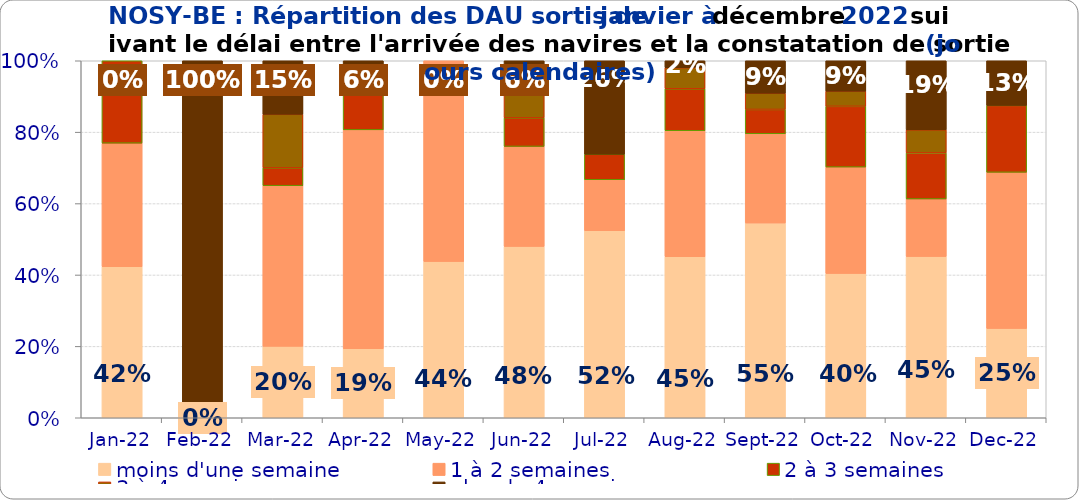
| Category | moins d'une semaine | 1 à 2 semaines | 2 à 3 semaines | 3 à 4 semaines | plus de 4 semaines |
|---|---|---|---|---|---|
| 2022-01-01 | 0.423 | 0.346 | 0.231 | 0 | 0 |
| 2022-02-01 | 0 | 0 | 0 | 0 | 1 |
| 2022-03-01 | 0.2 | 0.45 | 0.05 | 0.15 | 0.15 |
| 2022-04-01 | 0.194 | 0.613 | 0.129 | 0 | 0.065 |
| 2022-05-01 | 0.438 | 0.562 | 0 | 0 | 0 |
| 2022-06-01 | 0.48 | 0.28 | 0.08 | 0.1 | 0.06 |
| 2022-07-01 | 0.524 | 0.143 | 0.071 | 0 | 0.262 |
| 2022-08-01 | 0.451 | 0.353 | 0.118 | 0.059 | 0.02 |
| 2022-09-01 | 0.545 | 0.25 | 0.068 | 0.045 | 0.091 |
| 2022-10-01 | 0.404 | 0.298 | 0.17 | 0.043 | 0.085 |
| 2022-11-01 | 0.452 | 0.161 | 0.129 | 0.065 | 0.194 |
| 2022-12-01 | 0.25 | 0.438 | 0.188 | 0 | 0.125 |